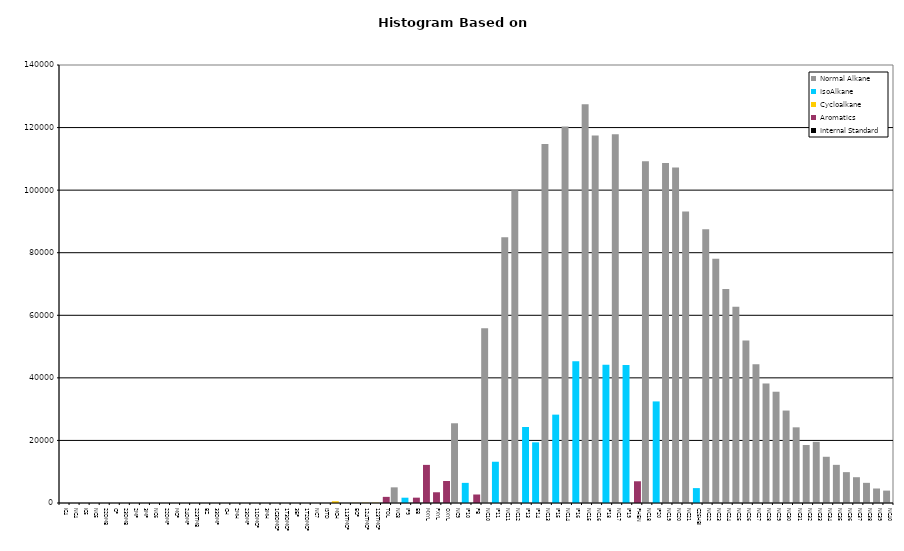
| Category | Normal Alkane | IsoAlkane | Cycloalkane | Aromatics | Internal Standard |
|---|---|---|---|---|---|
| IC4 | 0 | 0 | 0 | 0 | 0 |
| NC4 | 0 | 0 | 0 | 0 | 0 |
| IC5 | 0 | 0 | 0 | 0 | 0 |
| NC5 | 0 | 0 | 0 | 0 | 0 |
| 22DMB | 0 | 0 | 0 | 0 | 0 |
| CP | 0 | 0 | 0 | 0 | 0 |
| 23DMB | 0 | 0 | 0 | 0 | 0 |
| 2MP | 0 | 0 | 0 | 0 | 0 |
| 3MP | 0 | 0 | 0 | 0 | 0 |
| NC6 | 0 | 0 | 0 | 0 | 0 |
| 22DMP | 0 | 0 | 0 | 0 | 0 |
| MCP | 0 | 0 | 0 | 0 | 0 |
| 24DMP | 0 | 0 | 0 | 0 | 0 |
| 223TMB | 0 | 0 | 0 | 0 | 0 |
| BZ | 0 | 0 | 0 | 0 | 0 |
| 33DMP | 0 | 0 | 0 | 0 | 0 |
| CH | 0 | 0 | 0 | 0 | 0 |
| 2MH | 0 | 0 | 0 | 0 | 0 |
| 23DMP | 0 | 0 | 0 | 0 | 0 |
| 11DMCP | 0 | 0 | 0 | 0 | 0 |
| 3MH | 0 | 0 | 0 | 0 | 0 |
| 1C3DMCP | 0 | 0 | 0 | 0 | 0 |
| 1T3DMCP | 0 | 0 | 0 | 0 | 0 |
| 3EP | 0 | 0 | 0 | 0 | 0 |
| 1T2DMCP | 0 | 0 | 0 | 0 | 0 |
| NC7 | 0 | 0 | 0 | 0 | 0 |
| ISTD | 0 | 0 | 0 | 0 | 0 |
| MCH | 0 | 0 | 560 | 0 | 0 |
| 113TMCP | 0 | 0 | 0 | 0 | 0 |
| ECP | 0 | 0 | 48 | 0 | 0 |
| 124TMCP | 0 | 0 | 79 | 0 | 0 |
| 123TMCP | 0 | 0 | 85 | 0 | 0 |
| TOL | 0 | 0 | 0 | 1961 | 0 |
| NC8 | 5005 | 0 | 0 | 0 | 0 |
| IP9 | 0 | 1694 | 0 | 0 | 0 |
| EB | 0 | 0 | 0 | 1708 | 0 |
| MXYL | 0 | 0 | 0 | 12182 | 0 |
| PXYL | 0 | 0 | 0 | 3433 | 0 |
| OXYL | 0 | 0 | 0 | 7027 | 0 |
| NC9 | 25486 | 0 | 0 | 0 | 0 |
| IP10 | 0 | 6435 | 0 | 0 | 0 |
| PB | 0 | 0 | 0 | 2718 | 0 |
| NC10 | 55872 | 0 | 0 | 0 | 0 |
| IP11 | 0 | 13189 | 0 | 0 | 0 |
| NC11 | 84911 | 0 | 0 | 0 | 0 |
| NC12 | 99978 | 0 | 0 | 0 | 0 |
| IP13 | 0 | 24295 | 0 | 0 | 0 |
| IP14 | 0 | 19393 | 0 | 0 | 0 |
| NC13 | 114778 | 0 | 0 | 0 | 0 |
| IP15 | 0 | 28245 | 0 | 0 | 0 |
| NC14 | 120364 | 0 | 0 | 0 | 0 |
| IP16 | 0 | 45296 | 0 | 0 | 0 |
| NC15 | 127437 | 0 | 0 | 0 | 0 |
| NC16 | 117505 | 0 | 0 | 0 | 0 |
| IP18 | 0 | 44184 | 0 | 0 | 0 |
| NC17 | 117904 | 0 | 0 | 0 | 0 |
| IP19 | 0 | 44132 | 0 | 0 | 0 |
| PHEN | 0 | 0 | 0 | 6946 | 0 |
| NC18 | 109237 | 0 | 0 | 0 | 0 |
| IP20 | 0 | 32471 | 0 | 0 | 0 |
| NC19 | 108697 | 0 | 0 | 0 | 0 |
| NC20 | 107210 | 0 | 0 | 0 | 0 |
| NC21 | 93167 | 0 | 0 | 0 | 0 |
| C25HBI | 0 | 4761 | 0 | 0 | 0 |
| NC22 | 87482 | 0 | 0 | 0 | 0 |
| NC23 | 78036 | 0 | 0 | 0 | 0 |
| NC24 | 68370 | 0 | 0 | 0 | 0 |
| NC25 | 62726 | 0 | 0 | 0 | 0 |
| NC26 | 51980 | 0 | 0 | 0 | 0 |
| NC27 | 44333 | 0 | 0 | 0 | 0 |
| NC28 | 38205 | 0 | 0 | 0 | 0 |
| NC29 | 35567 | 0 | 0 | 0 | 0 |
| NC30 | 29550 | 0 | 0 | 0 | 0 |
| NC31 | 24188 | 0 | 0 | 0 | 0 |
| NC32 | 18542 | 0 | 0 | 0 | 0 |
| NC33 | 19556 | 0 | 0 | 0 | 0 |
| NC34 | 14776 | 0 | 0 | 0 | 0 |
| NC35 | 12195 | 0 | 0 | 0 | 0 |
| NC36 | 9862 | 0 | 0 | 0 | 0 |
| NC37 | 8245 | 0 | 0 | 0 | 0 |
| NC38 | 6445 | 0 | 0 | 0 | 0 |
| NC39 | 4636 | 0 | 0 | 0 | 0 |
| NC40 | 3961 | 0 | 0 | 0 | 0 |